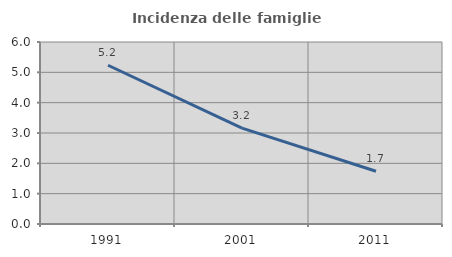
| Category | Incidenza delle famiglie numerose |
|---|---|
| 1991.0 | 5.233 |
| 2001.0 | 3.16 |
| 2011.0 | 1.737 |